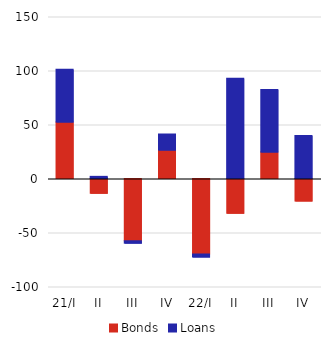
| Category | Bonds | Loans |
|---|---|---|
| 21/I | 52.335 | 48.708 |
| II | -13.668 | 1.987 |
| III | -57.657 | -2.213 |
| IV | 26.344 | 14.945 |
| 22/I | -69.811 | -2.889 |
| II | -32.139 | 92.776 |
| III | 24.501 | 57.866 |
| IV | -20.86 | 39.805 |